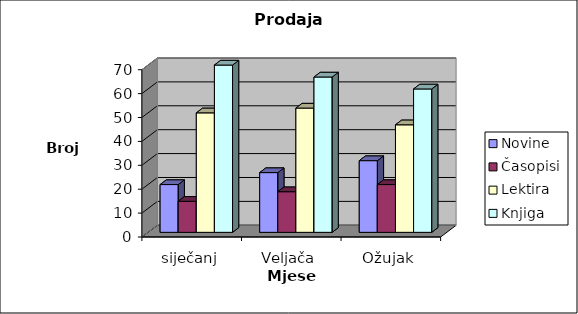
| Category | Novine | Časopisi | Lektira | Knjiga |
|---|---|---|---|---|
| siječanj | 20 | 13 | 50 | 70 |
| Veljača | 25 | 17 | 52 | 65 |
| Ožujak | 30 | 20 | 45 | 60 |